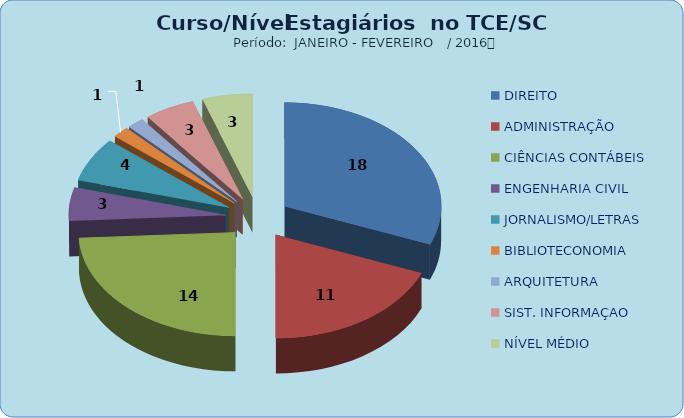
| Category | Series 0 |
|---|---|
| DIREITO | 18 |
| ADMINISTRAÇÃO | 11 |
| CIÊNCIAS CONTÁBEIS | 14 |
| ENGENHARIA CIVIL | 3 |
| JORNALISMO/LETRAS | 4 |
| BIBLIOTECONOMIA | 1 |
| ARQUITETURA | 1 |
| SIST. INFORMAÇAO | 3 |
| NÍVEL MÉDIO | 3 |